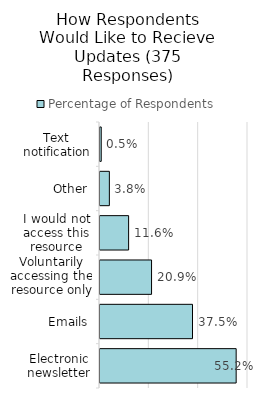
| Category | Percentage of Respondents |
|---|---|
| Electronic newsletter | 0.552 |
| Emails | 0.375 |
| Voluntarily accessing the resource only | 0.209 |
| I would not access this resource | 0.116 |
| Other | 0.038 |
| Text notification | 0.005 |